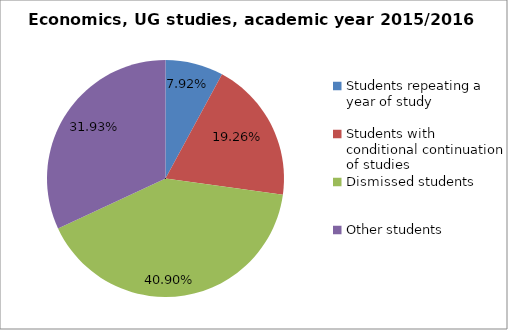
| Category | Series 0 |
|---|---|
| Students repeating a year of study | 30 |
| Students with conditional continuation of studies | 73 |
| Dismissed students | 155 |
| Other students | 121 |